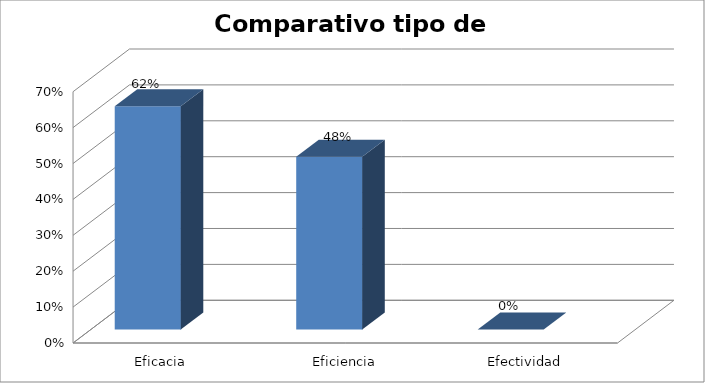
| Category | 2016 | Series 1 |
|---|---|---|
| Eficacia  | 0.622 |  |
| Eficiencia | 0.481 |  |
| Efectividad | 0 |  |